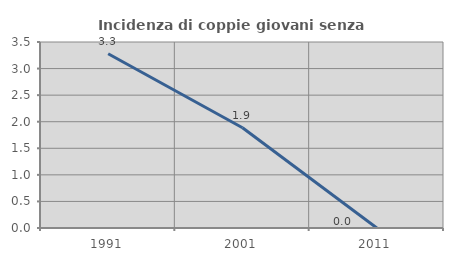
| Category | Incidenza di coppie giovani senza figli |
|---|---|
| 1991.0 | 3.279 |
| 2001.0 | 1.887 |
| 2011.0 | 0 |